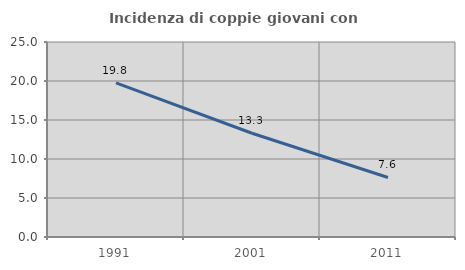
| Category | Incidenza di coppie giovani con figli |
|---|---|
| 1991.0 | 19.76 |
| 2001.0 | 13.298 |
| 2011.0 | 7.634 |